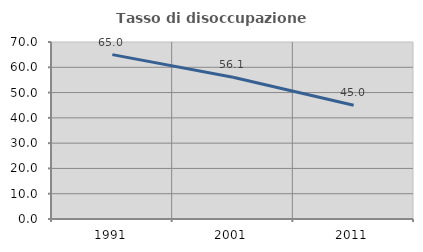
| Category | Tasso di disoccupazione giovanile  |
|---|---|
| 1991.0 | 65.014 |
| 2001.0 | 56.075 |
| 2011.0 | 44.961 |